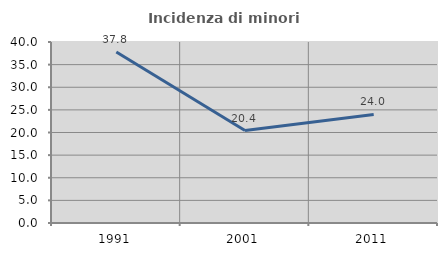
| Category | Incidenza di minori stranieri |
|---|---|
| 1991.0 | 37.778 |
| 2001.0 | 20.43 |
| 2011.0 | 23.988 |